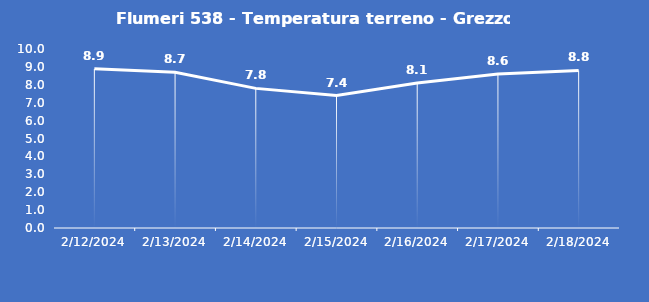
| Category | Flumeri 538 - Temperatura terreno - Grezzo (°C) |
|---|---|
| 2/12/24 | 8.9 |
| 2/13/24 | 8.7 |
| 2/14/24 | 7.8 |
| 2/15/24 | 7.4 |
| 2/16/24 | 8.1 |
| 2/17/24 | 8.6 |
| 2/18/24 | 8.8 |